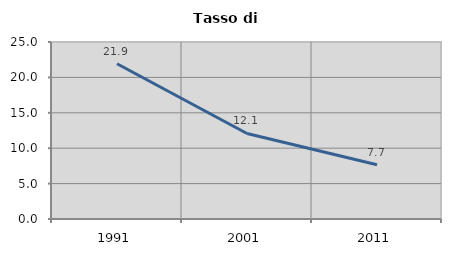
| Category | Tasso di disoccupazione   |
|---|---|
| 1991.0 | 21.925 |
| 2001.0 | 12.077 |
| 2011.0 | 7.664 |